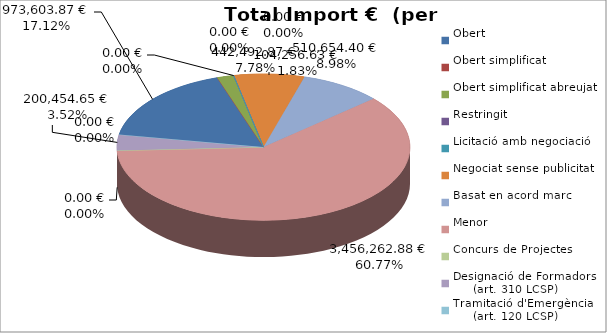
| Category | Total preu
(amb IVA) |
|---|---|
| Obert | 973603.87 |
| Obert simplificat | 0 |
| Obert simplificat abreujat | 104256.63 |
| Restringit | 0 |
| Licitació amb negociació | 0 |
| Negociat sense publicitat | 442492.873 |
| Basat en acord marc | 510654.4 |
| Menor | 3456262.88 |
| Concurs de Projectes | 0 |
| Designació de Formadors
     (art. 310 LCSP) | 200454.65 |
| Tramitació d'Emergència
     (art. 120 LCSP) | 0 |